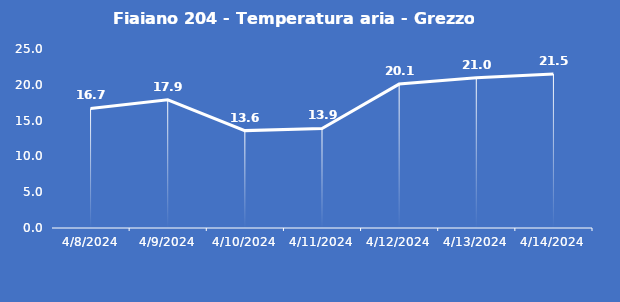
| Category | Fiaiano 204 - Temperatura aria - Grezzo (°C) |
|---|---|
| 4/8/24 | 16.7 |
| 4/9/24 | 17.9 |
| 4/10/24 | 13.6 |
| 4/11/24 | 13.9 |
| 4/12/24 | 20.1 |
| 4/13/24 | 21 |
| 4/14/24 | 21.5 |